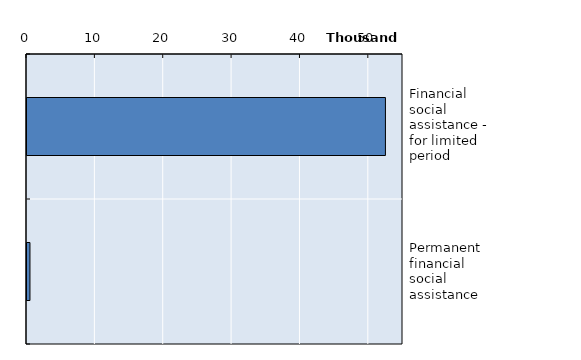
| Category | Series 0 |
|---|---|
| Financial social assistance - for limited period | 52429 |
| Permanent financial social assistance | 433 |